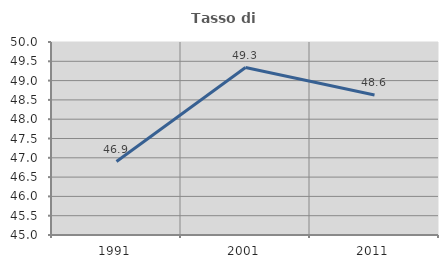
| Category | Tasso di occupazione   |
|---|---|
| 1991.0 | 46.902 |
| 2001.0 | 49.338 |
| 2011.0 | 48.627 |